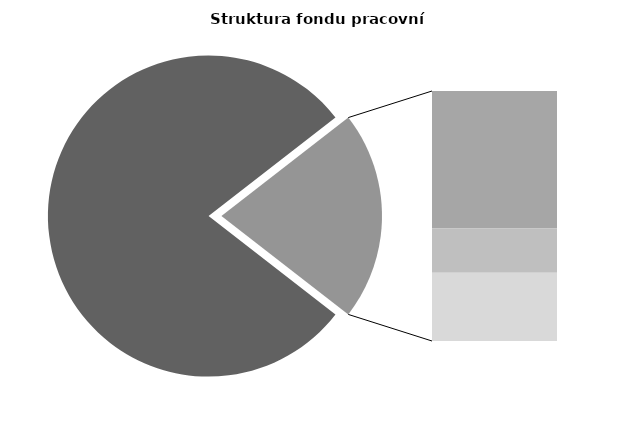
| Category | Series 0 |
|---|---|
| Průměrná měsíční odpracovaná doba bez přesčasu | 136.094 |
| Dovolená | 19.861 |
| Nemoc | 6.426 |
| Jiné | 9.893 |